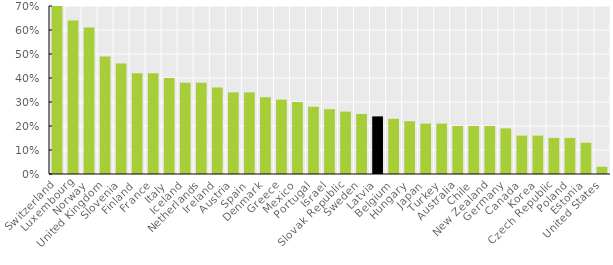
| Category | eur30 |
|---|---|
| Switzerland | 0.7 |
| Luxembourg | 0.64 |
| Norway | 0.61 |
| United Kingdom | 0.49 |
| Slovenia | 0.46 |
| Finland | 0.42 |
| France | 0.42 |
| Italy | 0.4 |
| Iceland | 0.38 |
| Netherlands | 0.38 |
| Ireland | 0.36 |
| Austria | 0.34 |
| Spain | 0.34 |
| Denmark | 0.32 |
| Greece | 0.31 |
| Mexico | 0.3 |
| Portugal | 0.28 |
| Israel | 0.27 |
| Slovak Republic | 0.26 |
| Sweden | 0.25 |
| Latvia | 0.24 |
| Belgium | 0.23 |
| Hungary | 0.22 |
| Japan | 0.21 |
| Turkey | 0.21 |
| Australia | 0.2 |
| Chile | 0.2 |
| New Zealand | 0.2 |
| Germany | 0.19 |
| Canada | 0.16 |
| Korea | 0.16 |
| Czech Republic | 0.15 |
| Poland | 0.15 |
| Estonia | 0.13 |
| United States | 0.03 |